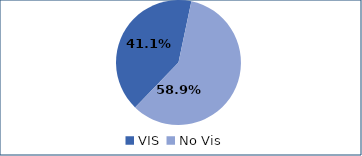
| Category | Series 0 |
|---|---|
| VIS | 0.411 |
| No Vis | 0.589 |